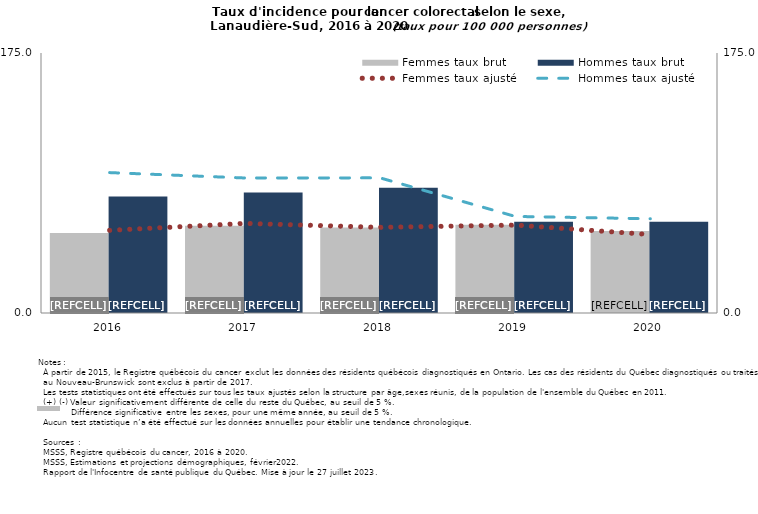
| Category | Femmes taux brut | Hommes taux brut |
|---|---|---|
| 2016.0 | 53.845 | 78.449 |
| 2017.0 | 58.727 | 81.154 |
| 2018.0 | 57.468 | 84.36 |
| 2019.0 | 59.355 | 61.45 |
| 2020.0 | 55.189 | 61.37 |